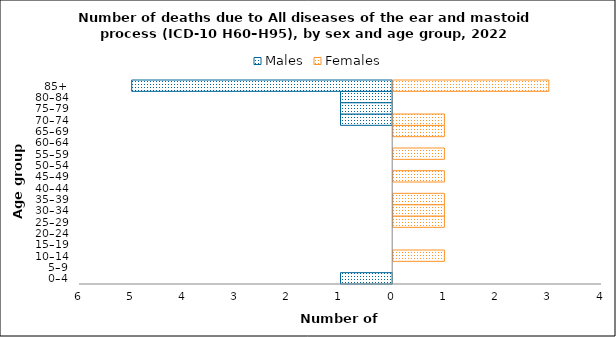
| Category | Males | Females |
|---|---|---|
| 0–4 | -1 | 0 |
| 5–9 | 0 | 0 |
| 10–14 | 0 | 1 |
| 15–19 | 0 | 0 |
| 20–24 | 0 | 0 |
| 25–29 | 0 | 1 |
| 30–34 | 0 | 1 |
| 35–39 | 0 | 1 |
| 40–44 | 0 | 0 |
| 45–49 | 0 | 1 |
| 50–54 | 0 | 0 |
| 55–59 | 0 | 1 |
| 60–64 | 0 | 0 |
| 65–69 | 0 | 1 |
| 70–74 | -1 | 1 |
| 75–79 | -1 | 0 |
| 80–84 | -1 | 0 |
| 85+ | -5 | 3 |